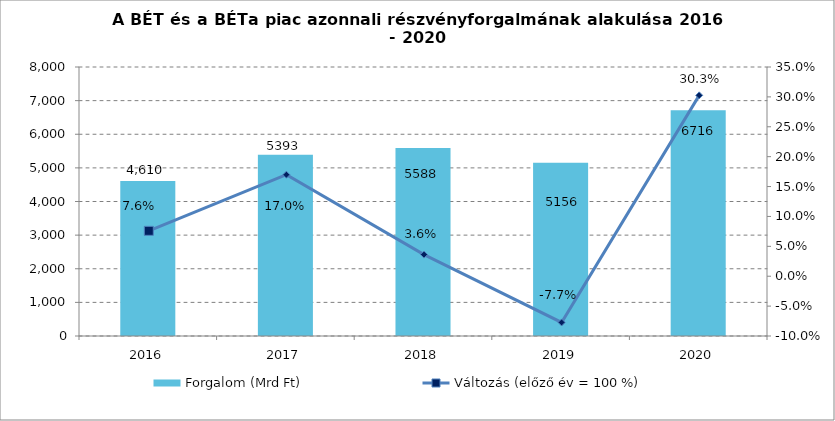
| Category | Forgalom (Mrd Ft) |
|---|---|
| 2016.0 | 4610 |
| 2017.0 | 5393 |
| 2018.0 | 5588 |
| 2019.0 | 5156 |
| 2020.0 | 6716 |